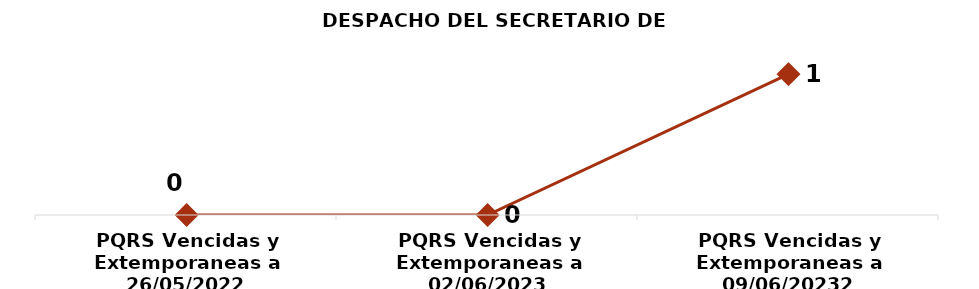
| Category | DESPACHO DEL SECRETARIO DE GOBIERNO  |
|---|---|
| PQRS Vencidas y Extemporaneas a 26/05/2022 | 0 |
| PQRS Vencidas y Extemporaneas a 02/06/2023 | 0 |
| PQRS Vencidas y Extemporaneas a 09/06/20232 | 1 |